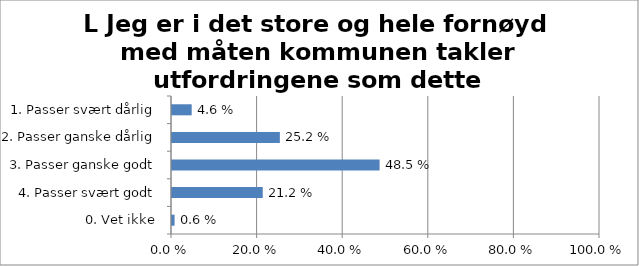
| Category | L Jeg er i det store og hele fornøyd med måten kommunen takler utfordringene som dette lokalsamfunnet står overfor |
|---|---|
| 1. Passer svært dårlig | 0.046 |
| 2. Passer ganske dårlig | 0.252 |
| 3. Passer ganske godt | 0.485 |
| 4. Passer svært godt | 0.212 |
| 0. Vet ikke | 0.006 |